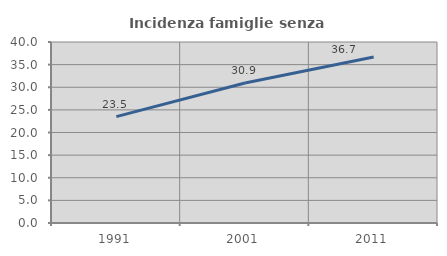
| Category | Incidenza famiglie senza nuclei |
|---|---|
| 1991.0 | 23.511 |
| 2001.0 | 30.941 |
| 2011.0 | 36.7 |